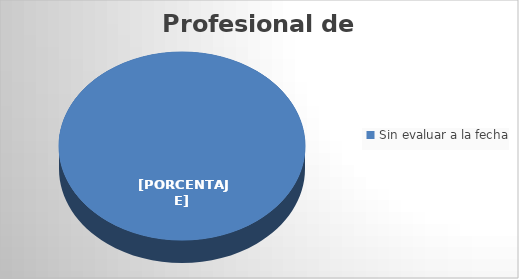
| Category | Cantidad |
|---|---|
| Sin evaluar a la fecha | 6 |